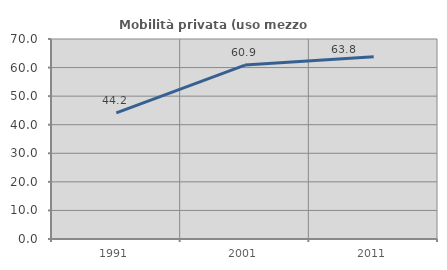
| Category | Mobilità privata (uso mezzo privato) |
|---|---|
| 1991.0 | 44.151 |
| 2001.0 | 60.863 |
| 2011.0 | 63.828 |